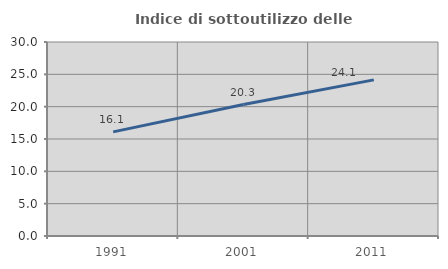
| Category | Indice di sottoutilizzo delle abitazioni  |
|---|---|
| 1991.0 | 16.101 |
| 2001.0 | 20.323 |
| 2011.0 | 24.146 |